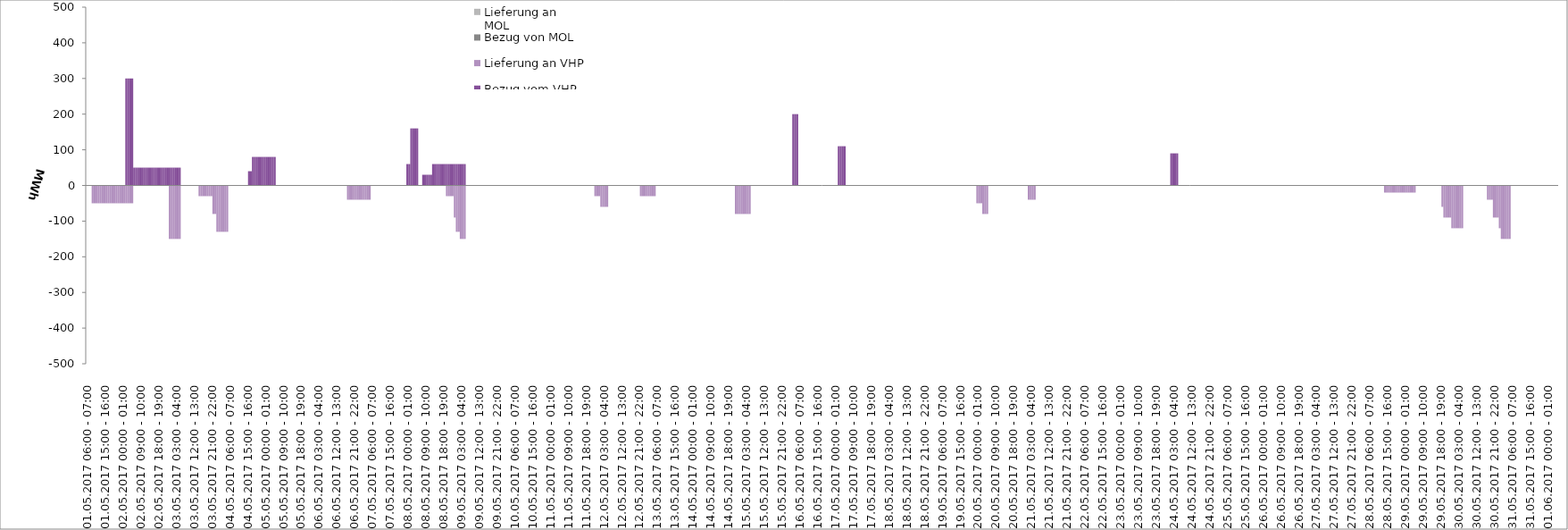
| Category | Bezug vom VHP | Lieferung an VHP | Bezug von MOL | Lieferung an MOL |
|---|---|---|---|---|
| 01.05.2017 06:00 - 07:00 | 0 | 0 | 0 | 0 |
| 01.05.2017 07:00 - 08:00 | 0 | 0 | 0 | 0 |
| 01.05.2017 08:00 - 09:00 | 0 | 0 | 0 | 0 |
| 01.05.2017 09:00 - 10:00 | 0 | -50 | 0 | 0 |
| 01.05.2017 10:00 - 11:00 | 0 | -50 | 0 | 0 |
| 01.05.2017 11:00 - 12:00 | 0 | -50 | 0 | 0 |
| 01.05.2017 12:00 - 13:00 | 0 | -50 | 0 | 0 |
| 01.05.2017 13:00 - 14:00 | 0 | -50 | 0 | 0 |
| 01.05.2017 14:00 - 15:00 | 0 | -50 | 0 | 0 |
| 01.05.2017 15:00 - 16:00 | 0 | -50 | 0 | 0 |
| 01.05.2017 16:00 - 17:00 | 0 | -50 | 0 | 0 |
| 01.05.2017 17:00 - 18:00 | 0 | -50 | 0 | 0 |
| 01.05.2017 18:00 - 19:00 | 0 | -50 | 0 | 0 |
| 01.05.2017 19:00 - 20:00 | 0 | -50 | 0 | 0 |
| 01.05.2017 20:00 - 21:00 | 0 | -50 | 0 | 0 |
| 01.05.2017 21:00 - 22:00 | 0 | -50 | 0 | 0 |
| 01.05.2017 22:00 - 23:00 | 0 | -50 | 0 | 0 |
| 01.05.2017 23:00 - 24:00 | 0 | -50 | 0 | 0 |
| 02.05.2017 00:00 - 01:00 | 0 | -50 | 0 | 0 |
| 02.05.2017 01:00 - 02:00 | 0 | -50 | 0 | 0 |
| 02.05.2017 02:00 - 03:00 | 300 | -50 | 0 | 0 |
| 02.05.2017 03:00 - 04:00 | 300 | -50 | 0 | 0 |
| 02.05.2017 04:00 - 05:00 | 300 | -50 | 0 | 0 |
| 02.05.2017 05:00 - 06:00 | 300 | -50 | 0 | 0 |
| 02.05.2017 06:00 - 07:00 | 50 | 0 | 0 | 0 |
| 02.05.2017 07:00 - 08:00 | 50 | 0 | 0 | 0 |
| 02.05.2017 08:00 - 09:00 | 50 | 0 | 0 | 0 |
| 02.05.2017 09:00 - 10:00 | 50 | 0 | 0 | 0 |
| 02.05.2017 10:00 - 11:00 | 50 | 0 | 0 | 0 |
| 02.05.2017 11:00 - 12:00 | 50 | 0 | 0 | 0 |
| 02.05.2017 12:00 - 13:00 | 50 | 0 | 0 | 0 |
| 02.05.2017 13:00 - 14:00 | 50 | 0 | 0 | 0 |
| 02.05.2017 14:00 - 15:00 | 50 | 0 | 0 | 0 |
| 02.05.2017 15:00 - 16:00 | 50 | 0 | 0 | 0 |
| 02.05.2017 16:00 - 17:00 | 50 | 0 | 0 | 0 |
| 02.05.2017 17:00 - 18:00 | 50 | 0 | 0 | 0 |
| 02.05.2017 18:00 - 19:00 | 50 | 0 | 0 | 0 |
| 02.05.2017 19:00 - 20:00 | 50 | 0 | 0 | 0 |
| 02.05.2017 20:00 - 21:00 | 50 | 0 | 0 | 0 |
| 02.05.2017 21:00 - 22:00 | 50 | 0 | 0 | 0 |
| 02.05.2017 22:00 - 23:00 | 50 | 0 | 0 | 0 |
| 02.05.2017 23:00 - 24:00 | 50 | 0 | 0 | 0 |
| 03.05.2017 00:00 - 01:00 | 50 | -150 | 0 | 0 |
| 03.05.2017 01:00 - 02:00 | 50 | -150 | 0 | 0 |
| 03.05.2017 02:00 - 03:00 | 50 | -150 | 0 | 0 |
| 03.05.2017 03:00 - 04:00 | 50 | -150 | 0 | 0 |
| 03.05.2017 04:00 - 05:00 | 50 | -150 | 0 | 0 |
| 03.05.2017 05:00 - 06:00 | 50 | -150 | 0 | 0 |
| 03.05.2017 06:00 - 07:00 | 0 | 0 | 0 | 0 |
| 03.05.2017 07:00 - 08:00 | 0 | 0 | 0 | 0 |
| 03.05.2017 08:00 - 09:00 | 0 | 0 | 0 | 0 |
| 03.05.2017 09:00 - 10:00 | 0 | 0 | 0 | 0 |
| 03.05.2017 10:00 - 11:00 | 0 | 0 | 0 | 0 |
| 03.05.2017 11:00 - 12:00 | 0 | 0 | 0 | 0 |
| 03.05.2017 12:00 - 13:00 | 0 | 0 | 0 | 0 |
| 03.05.2017 13:00 - 14:00 | 0 | 0 | 0 | 0 |
| 03.05.2017 14:00 - 15:00 | 0 | 0 | 0 | 0 |
| 03.05.2017 15:00 - 16:00 | 0 | -30 | 0 | 0 |
| 03.05.2017 16:00 - 17:00 | 0 | -30 | 0 | 0 |
| 03.05.2017 17:00 - 18:00 | 0 | -30 | 0 | 0 |
| 03.05.2017 18:00 - 19:00 | 0 | -30 | 0 | 0 |
| 03.05.2017 19:00 - 20:00 | 0 | -30 | 0 | 0 |
| 03.05.2017 20:00 - 21:00 | 0 | -30 | 0 | 0 |
| 03.05.2017 21:00 - 22:00 | 0 | -30 | 0 | 0 |
| 03.05.2017 22:00 - 23:00 | 0 | -80 | 0 | 0 |
| 03.05.2017 23:00 - 24:00 | 0 | -80 | 0 | 0 |
| 04.05.2017 00:00 - 01:00 | 0 | -130 | 0 | 0 |
| 04.05.2017 01:00 - 02:00 | 0 | -130 | 0 | 0 |
| 04.05.2017 02:00 - 03:00 | 0 | -130 | 0 | 0 |
| 04.05.2017 03:00 - 04:00 | 0 | -130 | 0 | 0 |
| 04.05.2017 04:00 - 05:00 | 0 | -130 | 0 | 0 |
| 04.05.2017 05:00 - 06:00 | 0 | -130 | 0 | 0 |
| 04.05.2017 06:00 - 07:00 | 0 | 0 | 0 | 0 |
| 04.05.2017 07:00 - 08:00 | 0 | 0 | 0 | 0 |
| 04.05.2017 08:00 - 09:00 | 0 | 0 | 0 | 0 |
| 04.05.2017 09:00 - 10:00 | 0 | 0 | 0 | 0 |
| 04.05.2017 10:00 - 11:00 | 0 | 0 | 0 | 0 |
| 04.05.2017 11:00 - 12:00 | 0 | 0 | 0 | 0 |
| 04.05.2017 12:00 - 13:00 | 0 | 0 | 0 | 0 |
| 04.05.2017 13:00 - 14:00 | 0 | 0 | 0 | 0 |
| 04.05.2017 14:00 - 15:00 | 0 | 0 | 0 | 0 |
| 04.05.2017 15:00 - 16:00 | 0 | 0 | 0 | 0 |
| 04.05.2017 16:00 - 17:00 | 40 | 0 | 0 | 0 |
| 04.05.2017 17:00 - 18:00 | 40 | 0 | 0 | 0 |
| 04.05.2017 18:00 - 19:00 | 80 | 0 | 0 | 0 |
| 04.05.2017 19:00 - 20:00 | 80 | 0 | 0 | 0 |
| 04.05.2017 20:00 - 21:00 | 80 | 0 | 0 | 0 |
| 04.05.2017 21:00 - 22:00 | 80 | 0 | 0 | 0 |
| 04.05.2017 22:00 - 23:00 | 80 | 0 | 0 | 0 |
| 04.05.2017 23:00 - 24:00 | 80 | 0 | 0 | 0 |
| 05.05.2017 00:00 - 01:00 | 80 | 0 | 0 | 0 |
| 05.05.2017 01:00 - 02:00 | 80 | 0 | 0 | 0 |
| 05.05.2017 02:00 - 03:00 | 80 | 0 | 0 | 0 |
| 05.05.2017 03:00 - 04:00 | 80 | 0 | 0 | 0 |
| 05.05.2017 04:00 - 05:00 | 80 | 0 | 0 | 0 |
| 05.05.2017 05:00 - 06:00 | 80 | 0 | 0 | 0 |
| 05.05.2017 06:00 - 07:00 | 0 | 0 | 0 | 0 |
| 05.05.2017 07:00 - 08:00 | 0 | 0 | 0 | 0 |
| 05.05.2017 08:00 - 09:00 | 0 | 0 | 0 | 0 |
| 05.05.2017 09:00 - 10:00 | 0 | 0 | 0 | 0 |
| 05.05.2017 10:00 - 11:00 | 0 | 0 | 0 | 0 |
| 05.05.2017 11:00 - 12:00 | 0 | 0 | 0 | 0 |
| 05.05.2017 12:00 - 13:00 | 0 | 0 | 0 | 0 |
| 05.05.2017 13:00 - 14:00 | 0 | 0 | 0 | 0 |
| 05.05.2017 14:00 - 15:00 | 0 | 0 | 0 | 0 |
| 05.05.2017 15:00 - 16:00 | 0 | 0 | 0 | 0 |
| 05.05.2017 16:00 - 17:00 | 0 | 0 | 0 | 0 |
| 05.05.2017 17:00 - 18:00 | 0 | 0 | 0 | 0 |
| 05.05.2017 18:00 - 19:00 | 0 | 0 | 0 | 0 |
| 05.05.2017 19:00 - 20:00 | 0 | 0 | 0 | 0 |
| 05.05.2017 20:00 - 21:00 | 0 | 0 | 0 | 0 |
| 05.05.2017 21:00 - 22:00 | 0 | 0 | 0 | 0 |
| 05.05.2017 22:00 - 23:00 | 0 | 0 | 0 | 0 |
| 05.05.2017 23:00 - 24:00 | 0 | 0 | 0 | 0 |
| 06.05.2017 00:00 - 01:00 | 0 | 0 | 0 | 0 |
| 06.05.2017 01:00 - 02:00 | 0 | 0 | 0 | 0 |
| 06.05.2017 02:00 - 03:00 | 0 | 0 | 0 | 0 |
| 06.05.2017 03:00 - 04:00 | 0 | 0 | 0 | 0 |
| 06.05.2017 04:00 - 05:00 | 0 | 0 | 0 | 0 |
| 06.05.2017 05:00 - 06:00 | 0 | 0 | 0 | 0 |
| 06.05.2017 06:00 - 07:00 | 0 | 0 | 0 | 0 |
| 06.05.2017 07:00 - 08:00 | 0 | 0 | 0 | 0 |
| 06.05.2017 08:00 - 09:00 | 0 | 0 | 0 | 0 |
| 06.05.2017 09:00 - 10:00 | 0 | 0 | 0 | 0 |
| 06.05.2017 10:00 - 11:00 | 0 | 0 | 0 | 0 |
| 06.05.2017 11:00 - 12:00 | 0 | 0 | 0 | 0 |
| 06.05.2017 12:00 - 13:00 | 0 | 0 | 0 | 0 |
| 06.05.2017 13:00 - 14:00 | 0 | 0 | 0 | 0 |
| 06.05.2017 14:00 - 15:00 | 0 | 0 | 0 | 0 |
| 06.05.2017 15:00 - 16:00 | 0 | 0 | 0 | 0 |
| 06.05.2017 16:00 - 17:00 | 0 | 0 | 0 | 0 |
| 06.05.2017 17:00 - 18:00 | 0 | 0 | 0 | 0 |
| 06.05.2017 18:00 - 19:00 | 0 | -40 | 0 | 0 |
| 06.05.2017 19:00 - 20:00 | 0 | -40 | 0 | 0 |
| 06.05.2017 20:00 - 21:00 | 0 | -40 | 0 | 0 |
| 06.05.2017 21:00 - 22:00 | 0 | -40 | 0 | 0 |
| 06.05.2017 22:00 - 23:00 | 0 | -40 | 0 | 0 |
| 06.05.2017 23:00 - 24:00 | 0 | -40 | 0 | 0 |
| 07.05.2017 00:00 - 01:00 | 0 | -40 | 0 | 0 |
| 07.05.2017 01:00 - 02:00 | 0 | -40 | 0 | 0 |
| 07.05.2017 02:00 - 03:00 | 0 | -40 | 0 | 0 |
| 07.05.2017 03:00 - 04:00 | 0 | -40 | 0 | 0 |
| 07.05.2017 04:00 - 05:00 | 0 | -40 | 0 | 0 |
| 07.05.2017 05:00 - 06:00 | 0 | -40 | 0 | 0 |
| 07.05.2017 06:00 - 07:00 | 0 | 0 | 0 | 0 |
| 07.05.2017 07:00 - 08:00 | 0 | 0 | 0 | 0 |
| 07.05.2017 08:00 - 09:00 | 0 | 0 | 0 | 0 |
| 07.05.2017 09:00 - 10:00 | 0 | 0 | 0 | 0 |
| 07.05.2017 10:00 - 11:00 | 0 | 0 | 0 | 0 |
| 07.05.2017 11:00 - 12:00 | 0 | 0 | 0 | 0 |
| 07.05.2017 12:00 - 13:00 | 0 | 0 | 0 | 0 |
| 07.05.2017 13:00 - 14:00 | 0 | 0 | 0 | 0 |
| 07.05.2017 14:00 - 15:00 | 0 | 0 | 0 | 0 |
| 07.05.2017 15:00 - 16:00 | 0 | 0 | 0 | 0 |
| 07.05.2017 16:00 - 17:00 | 0 | 0 | 0 | 0 |
| 07.05.2017 17:00 - 18:00 | 0 | 0 | 0 | 0 |
| 07.05.2017 18:00 - 19:00 | 0 | 0 | 0 | 0 |
| 07.05.2017 19:00 - 20:00 | 0 | 0 | 0 | 0 |
| 07.05.2017 20:00 - 21:00 | 0 | 0 | 0 | 0 |
| 07.05.2017 21:00 - 22:00 | 0 | 0 | 0 | 0 |
| 07.05.2017 22:00 - 23:00 | 0 | 0 | 0 | 0 |
| 07.05.2017 23:00 - 24:00 | 0 | 0 | 0 | 0 |
| 08.05.2017 00:00 - 01:00 | 60 | 0 | 0 | 0 |
| 08.05.2017 01:00 - 02:00 | 60 | 0 | 0 | 0 |
| 08.05.2017 02:00 - 03:00 | 160 | 0 | 0 | 0 |
| 08.05.2017 03:00 - 04:00 | 160 | 0 | 0 | 0 |
| 08.05.2017 04:00 - 05:00 | 160 | 0 | 0 | 0 |
| 08.05.2017 05:00 - 06:00 | 160 | 0 | 0 | 0 |
| 08.05.2017 06:00 - 07:00 | 0 | 0 | 0 | 0 |
| 08.05.2017 07:00 - 08:00 | 0 | 0 | 0 | 0 |
| 08.05.2017 08:00 - 09:00 | 30 | 0 | 0 | 0 |
| 08.05.2017 09:00 - 10:00 | 30 | 0 | 0 | 0 |
| 08.05.2017 10:00 - 11:00 | 30 | 0 | 0 | 0 |
| 08.05.2017 11:00 - 12:00 | 30 | 0 | 0 | 0 |
| 08.05.2017 12:00 - 13:00 | 30 | 0 | 0 | 0 |
| 08.05.2017 13:00 - 14:00 | 60 | 0 | 0 | 0 |
| 08.05.2017 14:00 - 15:00 | 60 | 0 | 0 | 0 |
| 08.05.2017 15:00 - 16:00 | 60 | 0 | 0 | 0 |
| 08.05.2017 16:00 - 17:00 | 60 | 0 | 0 | 0 |
| 08.05.2017 17:00 - 18:00 | 60 | 0 | 0 | 0 |
| 08.05.2017 18:00 - 19:00 | 60 | 0 | 0 | 0 |
| 08.05.2017 19:00 - 20:00 | 60 | 0 | 0 | 0 |
| 08.05.2017 20:00 - 21:00 | 60 | -30 | 0 | 0 |
| 08.05.2017 21:00 - 22:00 | 60 | -30 | 0 | 0 |
| 08.05.2017 22:00 - 23:00 | 60 | -30 | 0 | 0 |
| 08.05.2017 23:00 - 24:00 | 60 | -30 | 0 | 0 |
| 09.05.2017 00:00 - 01:00 | 60 | -90 | 0 | 0 |
| 09.05.2017 01:00 - 02:00 | 60 | -130 | 0 | 0 |
| 09.05.2017 02:00 - 03:00 | 60 | -130 | 0 | 0 |
| 09.05.2017 03:00 - 04:00 | 60 | -150 | 0 | 0 |
| 09.05.2017 04:00 - 05:00 | 60 | -150 | 0 | 0 |
| 09.05.2017 05:00 - 06:00 | 60 | -150 | 0 | 0 |
| 09.05.2017 06:00 - 07:00 | 0 | 0 | 0 | 0 |
| 09.05.2017 07:00 - 08:00 | 0 | 0 | 0 | 0 |
| 09.05.2017 08:00 - 09:00 | 0 | 0 | 0 | 0 |
| 09.05.2017 09:00 - 10:00 | 0 | 0 | 0 | 0 |
| 09.05.2017 10:00 - 11:00 | 0 | 0 | 0 | 0 |
| 09.05.2017 11:00 - 12:00 | 0 | 0 | 0 | 0 |
| 09.05.2017 12:00 - 13:00 | 0 | 0 | 0 | 0 |
| 09.05.2017 13:00 - 14:00 | 0 | 0 | 0 | 0 |
| 09.05.2017 14:00 - 15:00 | 0 | 0 | 0 | 0 |
| 09.05.2017 15:00 - 16:00 | 0 | 0 | 0 | 0 |
| 09.05.2017 16:00 - 17:00 | 0 | 0 | 0 | 0 |
| 09.05.2017 17:00 - 18:00 | 0 | 0 | 0 | 0 |
| 09.05.2017 18:00 - 19:00 | 0 | 0 | 0 | 0 |
| 09.05.2017 19:00 - 20:00 | 0 | 0 | 0 | 0 |
| 09.05.2017 20:00 - 21:00 | 0 | 0 | 0 | 0 |
| 09.05.2017 21:00 - 22:00 | 0 | 0 | 0 | 0 |
| 09.05.2017 22:00 - 23:00 | 0 | 0 | 0 | 0 |
| 09.05.2017 23:00 - 24:00 | 0 | 0 | 0 | 0 |
| 10.05.2017 00:00 - 01:00 | 0 | 0 | 0 | 0 |
| 10.05.2017 01:00 - 02:00 | 0 | 0 | 0 | 0 |
| 10.05.2017 02:00 - 03:00 | 0 | 0 | 0 | 0 |
| 10.05.2017 03:00 - 04:00 | 0 | 0 | 0 | 0 |
| 10.05.2017 04:00 - 05:00 | 0 | 0 | 0 | 0 |
| 10.05.2017 05:00 - 06:00 | 0 | 0 | 0 | 0 |
| 10.05.2017 06:00 - 07:00 | 0 | 0 | 0 | 0 |
| 10.05.2017 07:00 - 08:00 | 0 | 0 | 0 | 0 |
| 10.05.2017 08:00 - 09:00 | 0 | 0 | 0 | 0 |
| 10.05.2017 09:00 - 10:00 | 0 | 0 | 0 | 0 |
| 10.05.2017 10:00 - 11:00 | 0 | 0 | 0 | 0 |
| 10.05.2017 11:00 - 12:00 | 0 | 0 | 0 | 0 |
| 10.05.2017 12:00 - 13:00 | 0 | 0 | 0 | 0 |
| 10.05.2017 13:00 - 14:00 | 0 | 0 | 0 | 0 |
| 10.05.2017 14:00 - 15:00 | 0 | 0 | 0 | 0 |
| 10.05.2017 15:00 - 16:00 | 0 | 0 | 0 | 0 |
| 10.05.2017 16:00 - 17:00 | 0 | 0 | 0 | 0 |
| 10.05.2017 17:00 - 18:00 | 0 | 0 | 0 | 0 |
| 10.05.2017 18:00 - 19:00 | 0 | 0 | 0 | 0 |
| 10.05.2017 19:00 - 20:00 | 0 | 0 | 0 | 0 |
| 10.05.2017 20:00 - 21:00 | 0 | 0 | 0 | 0 |
| 10.05.2017 21:00 - 22:00 | 0 | 0 | 0 | 0 |
| 10.05.2017 22:00 - 23:00 | 0 | 0 | 0 | 0 |
| 10.05.2017 23:00 - 24:00 | 0 | 0 | 0 | 0 |
| 11.05.2017 00:00 - 01:00 | 0 | 0 | 0 | 0 |
| 11.05.2017 01:00 - 02:00 | 0 | 0 | 0 | 0 |
| 11.05.2017 02:00 - 03:00 | 0 | 0 | 0 | 0 |
| 11.05.2017 03:00 - 04:00 | 0 | 0 | 0 | 0 |
| 11.05.2017 04:00 - 05:00 | 0 | 0 | 0 | 0 |
| 11.05.2017 05:00 - 06:00 | 0 | 0 | 0 | 0 |
| 11.05.2017 06:00 - 07:00 | 0 | 0 | 0 | 0 |
| 11.05.2017 07:00 - 08:00 | 0 | 0 | 0 | 0 |
| 11.05.2017 08:00 - 09:00 | 0 | 0 | 0 | 0 |
| 11.05.2017 09:00 - 10:00 | 0 | 0 | 0 | 0 |
| 11.05.2017 10:00 - 11:00 | 0 | 0 | 0 | 0 |
| 11.05.2017 11:00 - 12:00 | 0 | 0 | 0 | 0 |
| 11.05.2017 12:00 - 13:00 | 0 | 0 | 0 | 0 |
| 11.05.2017 13:00 - 14:00 | 0 | 0 | 0 | 0 |
| 11.05.2017 14:00 - 15:00 | 0 | 0 | 0 | 0 |
| 11.05.2017 15:00 - 16:00 | 0 | 0 | 0 | 0 |
| 11.05.2017 16:00 - 17:00 | 0 | 0 | 0 | 0 |
| 11.05.2017 17:00 - 18:00 | 0 | 0 | 0 | 0 |
| 11.05.2017 18:00 - 19:00 | 0 | 0 | 0 | 0 |
| 11.05.2017 19:00 - 20:00 | 0 | 0 | 0 | 0 |
| 11.05.2017 20:00 - 21:00 | 0 | 0 | 0 | 0 |
| 11.05.2017 21:00 - 22:00 | 0 | 0 | 0 | 0 |
| 11.05.2017 22:00 - 23:00 | 0 | 0 | 0 | 0 |
| 11.05.2017 23:00 - 24:00 | 0 | -30 | 0 | 0 |
| 12.05.2017 00:00 - 01:00 | 0 | -30 | 0 | 0 |
| 12.05.2017 01:00 - 02:00 | 0 | -30 | 0 | 0 |
| 12.05.2017 02:00 - 03:00 | 0 | -60 | 0 | 0 |
| 12.05.2017 03:00 - 04:00 | 0 | -60 | 0 | 0 |
| 12.05.2017 04:00 - 05:00 | 0 | -60 | 0 | 0 |
| 12.05.2017 05:00 - 06:00 | 0 | -60 | 0 | 0 |
| 12.05.2017 06:00 - 07:00 | 0 | 0 | 0 | 0 |
| 12.05.2017 07:00 - 08:00 | 0 | 0 | 0 | 0 |
| 12.05.2017 08:00 - 09:00 | 0 | 0 | 0 | 0 |
| 12.05.2017 09:00 - 10:00 | 0 | 0 | 0 | 0 |
| 12.05.2017 10:00 - 11:00 | 0 | 0 | 0 | 0 |
| 12.05.2017 11:00 - 12:00 | 0 | 0 | 0 | 0 |
| 12.05.2017 12:00 - 13:00 | 0 | 0 | 0 | 0 |
| 12.05.2017 13:00 - 14:00 | 0 | 0 | 0 | 0 |
| 12.05.2017 14:00 - 15:00 | 0 | 0 | 0 | 0 |
| 12.05.2017 15:00 - 16:00 | 0 | 0 | 0 | 0 |
| 12.05.2017 16:00 - 17:00 | 0 | 0 | 0 | 0 |
| 12.05.2017 17:00 - 18:00 | 0 | 0 | 0 | 0 |
| 12.05.2017 18:00 - 19:00 | 0 | 0 | 0 | 0 |
| 12.05.2017 19:00 - 20:00 | 0 | 0 | 0 | 0 |
| 12.05.2017 20:00 - 21:00 | 0 | 0 | 0 | 0 |
| 12.05.2017 21:00 - 22:00 | 0 | 0 | 0 | 0 |
| 12.05.2017 22:00 - 23:00 | 0 | -30 | 0 | 0 |
| 12.05.2017 23:00 - 24:00 | 0 | -30 | 0 | 0 |
| 13.05.2017 00:00 - 01:00 | 0 | -30 | 0 | 0 |
| 13.05.2017 01:00 - 02:00 | 0 | -30 | 0 | 0 |
| 13.05.2017 02:00 - 03:00 | 0 | -30 | 0 | 0 |
| 13.05.2017 03:00 - 04:00 | 0 | -30 | 0 | 0 |
| 13.05.2017 04:00 - 05:00 | 0 | -30 | 0 | 0 |
| 13.05.2017 05:00 - 06:00 | 0 | -30 | 0 | 0 |
| 13.05.2017 06:00 - 07:00 | 0 | 0 | 0 | 0 |
| 13.05.2017 07:00 - 08:00 | 0 | 0 | 0 | 0 |
| 13.05.2017 08:00 - 09:00 | 0 | 0 | 0 | 0 |
| 13.05.2017 09:00 - 10:00 | 0 | 0 | 0 | 0 |
| 13.05.2017 10:00 - 11:00 | 0 | 0 | 0 | 0 |
| 13.05.2017 11:00 - 12:00 | 0 | 0 | 0 | 0 |
| 13.05.2017 12:00 - 13:00 | 0 | 0 | 0 | 0 |
| 13.05.2017 13:00 - 14:00 | 0 | 0 | 0 | 0 |
| 13.05.2017 14:00 - 15:00 | 0 | 0 | 0 | 0 |
| 13.05.2017 15:00 - 16:00 | 0 | 0 | 0 | 0 |
| 13.05.2017 16:00 - 17:00 | 0 | 0 | 0 | 0 |
| 13.05.2017 17:00 - 18:00 | 0 | 0 | 0 | 0 |
| 13.05.2017 18:00 - 19:00 | 0 | 0 | 0 | 0 |
| 13.05.2017 19:00 - 20:00 | 0 | 0 | 0 | 0 |
| 13.05.2017 20:00 - 21:00 | 0 | 0 | 0 | 0 |
| 13.05.2017 21:00 - 22:00 | 0 | 0 | 0 | 0 |
| 13.05.2017 22:00 - 23:00 | 0 | 0 | 0 | 0 |
| 13.05.2017 23:00 - 24:00 | 0 | 0 | 0 | 0 |
| 14.05.2017 00:00 - 01:00 | 0 | 0 | 0 | 0 |
| 14.05.2017 01:00 - 02:00 | 0 | 0 | 0 | 0 |
| 14.05.2017 02:00 - 03:00 | 0 | 0 | 0 | 0 |
| 14.05.2017 03:00 - 04:00 | 0 | 0 | 0 | 0 |
| 14.05.2017 04:00 - 05:00 | 0 | 0 | 0 | 0 |
| 14.05.2017 05:00 - 06:00 | 0 | 0 | 0 | 0 |
| 14.05.2017 06:00 - 07:00 | 0 | 0 | 0 | 0 |
| 14.05.2017 07:00 - 08:00 | 0 | 0 | 0 | 0 |
| 14.05.2017 08:00 - 09:00 | 0 | 0 | 0 | 0 |
| 14.05.2017 09:00 - 10:00 | 0 | 0 | 0 | 0 |
| 14.05.2017 10:00 - 11:00 | 0 | 0 | 0 | 0 |
| 14.05.2017 11:00 - 12:00 | 0 | 0 | 0 | 0 |
| 14.05.2017 12:00 - 13:00 | 0 | 0 | 0 | 0 |
| 14.05.2017 13:00 - 14:00 | 0 | 0 | 0 | 0 |
| 14.05.2017 14:00 - 15:00 | 0 | 0 | 0 | 0 |
| 14.05.2017 15:00 - 16:00 | 0 | 0 | 0 | 0 |
| 14.05.2017 16:00 - 17:00 | 0 | 0 | 0 | 0 |
| 14.05.2017 17:00 - 18:00 | 0 | 0 | 0 | 0 |
| 14.05.2017 18:00 - 19:00 | 0 | 0 | 0 | 0 |
| 14.05.2017 19:00 - 20:00 | 0 | 0 | 0 | 0 |
| 14.05.2017 20:00 - 21:00 | 0 | 0 | 0 | 0 |
| 14.05.2017 21:00 - 22:00 | 0 | 0 | 0 | 0 |
| 14.05.2017 22:00 - 23:00 | 0 | -80 | 0 | 0 |
| 14.05.2017 23:00 - 24:00 | 0 | -80 | 0 | 0 |
| 15.05.2017 00:00 - 01:00 | 0 | -80 | 0 | 0 |
| 15.05.2017 01:00 - 02:00 | 0 | -80 | 0 | 0 |
| 15.05.2017 02:00 - 03:00 | 0 | -80 | 0 | 0 |
| 15.05.2017 03:00 - 04:00 | 0 | -80 | 0 | 0 |
| 15.05.2017 04:00 - 05:00 | 0 | -80 | 0 | 0 |
| 15.05.2017 05:00 - 06:00 | 0 | -80 | 0 | 0 |
| 15.05.2017 06:00 - 07:00 | 0 | 0 | 0 | 0 |
| 15.05.2017 07:00 - 08:00 | 0 | 0 | 0 | 0 |
| 15.05.2017 08:00 - 09:00 | 0 | 0 | 0 | 0 |
| 15.05.2017 09:00 - 10:00 | 0 | 0 | 0 | 0 |
| 15.05.2017 10:00 - 11:00 | 0 | 0 | 0 | 0 |
| 15.05.2017 11:00 - 12:00 | 0 | 0 | 0 | 0 |
| 15.05.2017 12:00 - 13:00 | 0 | 0 | 0 | 0 |
| 15.05.2017 13:00 - 14:00 | 0 | 0 | 0 | 0 |
| 15.05.2017 14:00 - 15:00 | 0 | 0 | 0 | 0 |
| 15.05.2017 15:00 - 16:00 | 0 | 0 | 0 | 0 |
| 15.05.2017 16:00 - 17:00 | 0 | 0 | 0 | 0 |
| 15.05.2017 17:00 - 18:00 | 0 | 0 | 0 | 0 |
| 15.05.2017 18:00 - 19:00 | 0 | 0 | 0 | 0 |
| 15.05.2017 19:00 - 20:00 | 0 | 0 | 0 | 0 |
| 15.05.2017 20:00 - 21:00 | 0 | 0 | 0 | 0 |
| 15.05.2017 21:00 - 22:00 | 0 | 0 | 0 | 0 |
| 15.05.2017 22:00 - 23:00 | 0 | 0 | 0 | 0 |
| 15.05.2017 23:00 - 24:00 | 0 | 0 | 0 | 0 |
| 16.05.2017 00:00 - 01:00 | 0 | 0 | 0 | 0 |
| 16.05.2017 01:00 - 02:00 | 0 | 0 | 0 | 0 |
| 16.05.2017 02:00 - 03:00 | 0 | 0 | 0 | 0 |
| 16.05.2017 03:00 - 04:00 | 200 | 0 | 0 | 0 |
| 16.05.2017 04:00 - 05:00 | 200 | 0 | 0 | 0 |
| 16.05.2017 05:00 - 06:00 | 200 | 0 | 0 | 0 |
| 16.05.2017 06:00 - 07:00 | 0 | 0 | 0 | 0 |
| 16.05.2017 07:00 - 08:00 | 0 | 0 | 0 | 0 |
| 16.05.2017 08:00 - 09:00 | 0 | 0 | 0 | 0 |
| 16.05.2017 09:00 - 10:00 | 0 | 0 | 0 | 0 |
| 16.05.2017 10:00 - 11:00 | 0 | 0 | 0 | 0 |
| 16.05.2017 11:00 - 12:00 | 0 | 0 | 0 | 0 |
| 16.05.2017 12:00 - 13:00 | 0 | 0 | 0 | 0 |
| 16.05.2017 13:00 - 14:00 | 0 | 0 | 0 | 0 |
| 16.05.2017 14:00 - 15:00 | 0 | 0 | 0 | 0 |
| 16.05.2017 15:00 - 16:00 | 0 | 0 | 0 | 0 |
| 16.05.2017 16:00 - 17:00 | 0 | 0 | 0 | 0 |
| 16.05.2017 17:00 - 18:00 | 0 | 0 | 0 | 0 |
| 16.05.2017 18:00 - 19:00 | 0 | 0 | 0 | 0 |
| 16.05.2017 19:00 - 20:00 | 0 | 0 | 0 | 0 |
| 16.05.2017 20:00 - 21:00 | 0 | 0 | 0 | 0 |
| 16.05.2017 21:00 - 22:00 | 0 | 0 | 0 | 0 |
| 16.05.2017 22:00 - 23:00 | 0 | 0 | 0 | 0 |
| 16.05.2017 23:00 - 24:00 | 0 | 0 | 0 | 0 |
| 17.05.2017 00:00 - 01:00 | 0 | 0 | 0 | 0 |
| 17.05.2017 01:00 - 02:00 | 0 | 0 | 0 | 0 |
| 17.05.2017 02:00 - 03:00 | 110 | 0 | 0 | 0 |
| 17.05.2017 03:00 - 04:00 | 110 | 0 | 0 | 0 |
| 17.05.2017 04:00 - 05:00 | 110 | 0 | 0 | 0 |
| 17.05.2017 05:00 - 06:00 | 110 | 0 | 0 | 0 |
| 17.05.2017 06:00 - 07:00 | 0 | 0 | 0 | 0 |
| 17.05.2017 07:00 - 08:00 | 0 | 0 | 0 | 0 |
| 17.05.2017 08:00 - 09:00 | 0 | 0 | 0 | 0 |
| 17.05.2017 09:00 - 10:00 | 0 | 0 | 0 | 0 |
| 17.05.2017 10:00 - 11:00 | 0 | 0 | 0 | 0 |
| 17.05.2017 11:00 - 12:00 | 0 | 0 | 0 | 0 |
| 17.05.2017 12:00 - 13:00 | 0 | 0 | 0 | 0 |
| 17.05.2017 13:00 - 14:00 | 0 | 0 | 0 | 0 |
| 17.05.2017 14:00 - 15:00 | 0 | 0 | 0 | 0 |
| 17.05.2017 15:00 - 16:00 | 0 | 0 | 0 | 0 |
| 17.05.2017 16:00 - 17:00 | 0 | 0 | 0 | 0 |
| 17.05.2017 17:00 - 18:00 | 0 | 0 | 0 | 0 |
| 17.05.2017 18:00 - 19:00 | 0 | 0 | 0 | 0 |
| 17.05.2017 19:00 - 20:00 | 0 | 0 | 0 | 0 |
| 17.05.2017 20:00 - 21:00 | 0 | 0 | 0 | 0 |
| 17.05.2017 21:00 - 22:00 | 0 | 0 | 0 | 0 |
| 17.05.2017 22:00 - 23:00 | 0 | 0 | 0 | 0 |
| 17.05.2017 23:00 - 24:00 | 0 | 0 | 0 | 0 |
| 18.05.2017 00:00 - 01:00 | 0 | 0 | 0 | 0 |
| 18.05.2017 01:00 - 02:00 | 0 | 0 | 0 | 0 |
| 18.05.2017 02:00 - 03:00 | 0 | 0 | 0 | 0 |
| 18.05.2017 03:00 - 04:00 | 0 | 0 | 0 | 0 |
| 18.05.2017 04:00 - 05:00 | 0 | 0 | 0 | 0 |
| 18.05.2017 05:00 - 06:00 | 0 | 0 | 0 | 0 |
| 18.05.2017 06:00 - 07:00 | 0 | 0 | 0 | 0 |
| 18.05.2017 07:00 - 08:00 | 0 | 0 | 0 | 0 |
| 18.05.2017 08:00 - 09:00 | 0 | 0 | 0 | 0 |
| 18.05.2017 09:00 - 10:00 | 0 | 0 | 0 | 0 |
| 18.05.2017 10:00 - 11:00 | 0 | 0 | 0 | 0 |
| 18.05.2017 11:00 - 12:00 | 0 | 0 | 0 | 0 |
| 18.05.2017 12:00 - 13:00 | 0 | 0 | 0 | 0 |
| 18.05.2017 13:00 - 14:00 | 0 | 0 | 0 | 0 |
| 18.05.2017 14:00 - 15:00 | 0 | 0 | 0 | 0 |
| 18.05.2017 15:00 - 16:00 | 0 | 0 | 0 | 0 |
| 18.05.2017 16:00 - 17:00 | 0 | 0 | 0 | 0 |
| 18.05.2017 17:00 - 18:00 | 0 | 0 | 0 | 0 |
| 18.05.2017 18:00 - 19:00 | 0 | 0 | 0 | 0 |
| 18.05.2017 19:00 - 20:00 | 0 | 0 | 0 | 0 |
| 18.05.2017 20:00 - 21:00 | 0 | 0 | 0 | 0 |
| 18.05.2017 21:00 - 22:00 | 0 | 0 | 0 | 0 |
| 18.05.2017 22:00 - 23:00 | 0 | 0 | 0 | 0 |
| 18.05.2017 23:00 - 24:00 | 0 | 0 | 0 | 0 |
| 19.05.2017 00:00 - 01:00 | 0 | 0 | 0 | 0 |
| 19.05.2017 01:00 - 02:00 | 0 | 0 | 0 | 0 |
| 19.05.2017 02:00 - 03:00 | 0 | 0 | 0 | 0 |
| 19.05.2017 03:00 - 04:00 | 0 | 0 | 0 | 0 |
| 19.05.2017 04:00 - 05:00 | 0 | 0 | 0 | 0 |
| 19.05.2017 05:00 - 06:00 | 0 | 0 | 0 | 0 |
| 19.05.2017 06:00 - 07:00 | 0 | 0 | 0 | 0 |
| 19.05.2017 07:00 - 08:00 | 0 | 0 | 0 | 0 |
| 19.05.2017 08:00 - 09:00 | 0 | 0 | 0 | 0 |
| 19.05.2017 09:00 - 10:00 | 0 | 0 | 0 | 0 |
| 19.05.2017 10:00 - 11:00 | 0 | 0 | 0 | 0 |
| 19.05.2017 11:00 - 12:00 | 0 | 0 | 0 | 0 |
| 19.05.2017 12:00 - 13:00 | 0 | 0 | 0 | 0 |
| 19.05.2017 13:00 - 14:00 | 0 | 0 | 0 | 0 |
| 19.05.2017 14:00 - 15:00 | 0 | 0 | 0 | 0 |
| 19.05.2017 15:00 - 16:00 | 0 | 0 | 0 | 0 |
| 19.05.2017 16:00 - 17:00 | 0 | 0 | 0 | 0 |
| 19.05.2017 17:00 - 18:00 | 0 | 0 | 0 | 0 |
| 19.05.2017 18:00 - 19:00 | 0 | 0 | 0 | 0 |
| 19.05.2017 19:00 - 20:00 | 0 | 0 | 0 | 0 |
| 19.05.2017 20:00 - 21:00 | 0 | 0 | 0 | 0 |
| 19.05.2017 21:00 - 22:00 | 0 | 0 | 0 | 0 |
| 19.05.2017 22:00 - 23:00 | 0 | 0 | 0 | 0 |
| 19.05.2017 23:00 - 24:00 | 0 | 0 | 0 | 0 |
| 20.05.2017 00:00 - 01:00 | 0 | -50 | 0 | 0 |
| 20.05.2017 01:00 - 02:00 | 0 | -50 | 0 | 0 |
| 20.05.2017 02:00 - 03:00 | 0 | -50 | 0 | 0 |
| 20.05.2017 03:00 - 04:00 | 0 | -80 | 0 | 0 |
| 20.05.2017 04:00 - 05:00 | 0 | -80 | 0 | 0 |
| 20.05.2017 05:00 - 06:00 | 0 | -80 | 0 | 0 |
| 20.05.2017 06:00 - 07:00 | 0 | 0 | 0 | 0 |
| 20.05.2017 07:00 - 08:00 | 0 | 0 | 0 | 0 |
| 20.05.2017 08:00 - 09:00 | 0 | 0 | 0 | 0 |
| 20.05.2017 09:00 - 10:00 | 0 | 0 | 0 | 0 |
| 20.05.2017 10:00 - 11:00 | 0 | 0 | 0 | 0 |
| 20.05.2017 11:00 - 12:00 | 0 | 0 | 0 | 0 |
| 20.05.2017 12:00 - 13:00 | 0 | 0 | 0 | 0 |
| 20.05.2017 13:00 - 14:00 | 0 | 0 | 0 | 0 |
| 20.05.2017 14:00 - 15:00 | 0 | 0 | 0 | 0 |
| 20.05.2017 15:00 - 16:00 | 0 | 0 | 0 | 0 |
| 20.05.2017 16:00 - 17:00 | 0 | 0 | 0 | 0 |
| 20.05.2017 17:00 - 18:00 | 0 | 0 | 0 | 0 |
| 20.05.2017 18:00 - 19:00 | 0 | 0 | 0 | 0 |
| 20.05.2017 19:00 - 20:00 | 0 | 0 | 0 | 0 |
| 20.05.2017 20:00 - 21:00 | 0 | 0 | 0 | 0 |
| 20.05.2017 21:00 - 22:00 | 0 | 0 | 0 | 0 |
| 20.05.2017 22:00 - 23:00 | 0 | 0 | 0 | 0 |
| 20.05.2017 23:00 - 24:00 | 0 | 0 | 0 | 0 |
| 21.05.2017 00:00 - 01:00 | 0 | 0 | 0 | 0 |
| 21.05.2017 01:00 - 02:00 | 0 | 0 | 0 | 0 |
| 21.05.2017 02:00 - 03:00 | 0 | -40 | 0 | 0 |
| 21.05.2017 03:00 - 04:00 | 0 | -40 | 0 | 0 |
| 21.05.2017 04:00 - 05:00 | 0 | -40 | 0 | 0 |
| 21.05.2017 05:00 - 06:00 | 0 | -40 | 0 | 0 |
| 21.05.2017 06:00 - 07:00 | 0 | 0 | 0 | 0 |
| 21.05.2017 07:00 - 08:00 | 0 | 0 | 0 | 0 |
| 21.05.2017 08:00 - 09:00 | 0 | 0 | 0 | 0 |
| 21.05.2017 09:00 - 10:00 | 0 | 0 | 0 | 0 |
| 21.05.2017 10:00 - 11:00 | 0 | 0 | 0 | 0 |
| 21.05.2017 11:00 - 12:00 | 0 | 0 | 0 | 0 |
| 21.05.2017 12:00 - 13:00 | 0 | 0 | 0 | 0 |
| 21.05.2017 13:00 - 14:00 | 0 | 0 | 0 | 0 |
| 21.05.2017 14:00 - 15:00 | 0 | 0 | 0 | 0 |
| 21.05.2017 15:00 - 16:00 | 0 | 0 | 0 | 0 |
| 21.05.2017 16:00 - 17:00 | 0 | 0 | 0 | 0 |
| 21.05.2017 17:00 - 18:00 | 0 | 0 | 0 | 0 |
| 21.05.2017 18:00 - 19:00 | 0 | 0 | 0 | 0 |
| 21.05.2017 19:00 - 20:00 | 0 | 0 | 0 | 0 |
| 21.05.2017 20:00 - 21:00 | 0 | 0 | 0 | 0 |
| 21.05.2017 21:00 - 22:00 | 0 | 0 | 0 | 0 |
| 21.05.2017 22:00 - 23:00 | 0 | 0 | 0 | 0 |
| 21.05.2017 23:00 - 24:00 | 0 | 0 | 0 | 0 |
| 22.05.2017 00:00 - 01:00 | 0 | 0 | 0 | 0 |
| 22.05.2017 01:00 - 02:00 | 0 | 0 | 0 | 0 |
| 22.05.2017 02:00 - 03:00 | 0 | 0 | 0 | 0 |
| 22.05.2017 03:00 - 04:00 | 0 | 0 | 0 | 0 |
| 22.05.2017 04:00 - 05:00 | 0 | 0 | 0 | 0 |
| 22.05.2017 05:00 - 06:00 | 0 | 0 | 0 | 0 |
| 22.05.2017 06:00 - 07:00 | 0 | 0 | 0 | 0 |
| 22.05.2017 07:00 - 08:00 | 0 | 0 | 0 | 0 |
| 22.05.2017 08:00 - 09:00 | 0 | 0 | 0 | 0 |
| 22.05.2017 09:00 - 10:00 | 0 | 0 | 0 | 0 |
| 22.05.2017 10:00 - 11:00 | 0 | 0 | 0 | 0 |
| 22.05.2017 11:00 - 12:00 | 0 | 0 | 0 | 0 |
| 22.05.2017 12:00 - 13:00 | 0 | 0 | 0 | 0 |
| 22.05.2017 13:00 - 14:00 | 0 | 0 | 0 | 0 |
| 22.05.2017 14:00 - 15:00 | 0 | 0 | 0 | 0 |
| 22.05.2017 15:00 - 16:00 | 0 | 0 | 0 | 0 |
| 22.05.2017 16:00 - 17:00 | 0 | 0 | 0 | 0 |
| 22.05.2017 17:00 - 18:00 | 0 | 0 | 0 | 0 |
| 22.05.2017 18:00 - 19:00 | 0 | 0 | 0 | 0 |
| 22.05.2017 19:00 - 20:00 | 0 | 0 | 0 | 0 |
| 22.05.2017 20:00 - 21:00 | 0 | 0 | 0 | 0 |
| 22.05.2017 21:00 - 22:00 | 0 | 0 | 0 | 0 |
| 22.05.2017 22:00 - 23:00 | 0 | 0 | 0 | 0 |
| 22.05.2017 23:00 - 24:00 | 0 | 0 | 0 | 0 |
| 23.05.2017 00:00 - 01:00 | 0 | 0 | 0 | 0 |
| 23.05.2017 01:00 - 02:00 | 0 | 0 | 0 | 0 |
| 23.05.2017 02:00 - 03:00 | 0 | 0 | 0 | 0 |
| 23.05.2017 03:00 - 04:00 | 0 | 0 | 0 | 0 |
| 23.05.2017 04:00 - 05:00 | 0 | 0 | 0 | 0 |
| 23.05.2017 05:00 - 06:00 | 0 | 0 | 0 | 0 |
| 23.05.2017 06:00 - 07:00 | 0 | 0 | 0 | 0 |
| 23.05.2017 07:00 - 08:00 | 0 | 0 | 0 | 0 |
| 23.05.2017 08:00 - 09:00 | 0 | 0 | 0 | 0 |
| 23.05.2017 09:00 - 10:00 | 0 | 0 | 0 | 0 |
| 23.05.2017 10:00 - 11:00 | 0 | 0 | 0 | 0 |
| 23.05.2017 11:00 - 12:00 | 0 | 0 | 0 | 0 |
| 23.05.2017 12:00 - 13:00 | 0 | 0 | 0 | 0 |
| 23.05.2017 13:00 - 14:00 | 0 | 0 | 0 | 0 |
| 23.05.2017 14:00 - 15:00 | 0 | 0 | 0 | 0 |
| 23.05.2017 15:00 - 16:00 | 0 | 0 | 0 | 0 |
| 23.05.2017 16:00 - 17:00 | 0 | 0 | 0 | 0 |
| 23.05.2017 17:00 - 18:00 | 0 | 0 | 0 | 0 |
| 23.05.2017 18:00 - 19:00 | 0 | 0 | 0 | 0 |
| 23.05.2017 19:00 - 20:00 | 0 | 0 | 0 | 0 |
| 23.05.2017 20:00 - 21:00 | 0 | 0 | 0 | 0 |
| 23.05.2017 21:00 - 22:00 | 0 | 0 | 0 | 0 |
| 23.05.2017 22:00 - 23:00 | 0 | 0 | 0 | 0 |
| 23.05.2017 23:00 - 24:00 | 0 | 0 | 0 | 0 |
| 24.05.2017 00:00 - 01:00 | 0 | 0 | 0 | 0 |
| 24.05.2017 01:00 - 02:00 | 0 | 0 | 0 | 0 |
| 24.05.2017 02:00 - 03:00 | 90 | 0 | 0 | 0 |
| 24.05.2017 03:00 - 04:00 | 90 | 0 | 0 | 0 |
| 24.05.2017 04:00 - 05:00 | 90 | 0 | 0 | 0 |
| 24.05.2017 05:00 - 06:00 | 90 | 0 | 0 | 0 |
| 24.05.2017 06:00 - 07:00 | 0 | 0 | 0 | 0 |
| 24.05.2017 07:00 - 08:00 | 0 | 0 | 0 | 0 |
| 24.05.2017 08:00 - 09:00 | 0 | 0 | 0 | 0 |
| 24.05.2017 09:00 - 10:00 | 0 | 0 | 0 | 0 |
| 24.05.2017 10:00 - 11:00 | 0 | 0 | 0 | 0 |
| 24.05.2017 11:00 - 12:00 | 0 | 0 | 0 | 0 |
| 24.05.2017 12:00 - 13:00 | 0 | 0 | 0 | 0 |
| 24.05.2017 13:00 - 14:00 | 0 | 0 | 0 | 0 |
| 24.05.2017 14:00 - 15:00 | 0 | 0 | 0 | 0 |
| 24.05.2017 15:00 - 16:00 | 0 | 0 | 0 | 0 |
| 24.05.2017 16:00 - 17:00 | 0 | 0 | 0 | 0 |
| 24.05.2017 17:00 - 18:00 | 0 | 0 | 0 | 0 |
| 24.05.2017 18:00 - 19:00 | 0 | 0 | 0 | 0 |
| 24.05.2017 19:00 - 20:00 | 0 | 0 | 0 | 0 |
| 24.05.2017 20:00 - 21:00 | 0 | 0 | 0 | 0 |
| 24.05.2017 21:00 - 22:00 | 0 | 0 | 0 | 0 |
| 24.05.2017 22:00 - 23:00 | 0 | 0 | 0 | 0 |
| 24.05.2017 23:00 - 24:00 | 0 | 0 | 0 | 0 |
| 25.05.2017 00:00 - 01:00 | 0 | 0 | 0 | 0 |
| 25.05.2017 01:00 - 02:00 | 0 | 0 | 0 | 0 |
| 25.05.2017 02:00 - 03:00 | 0 | 0 | 0 | 0 |
| 25.05.2017 03:00 - 04:00 | 0 | 0 | 0 | 0 |
| 25.05.2017 04:00 - 05:00 | 0 | 0 | 0 | 0 |
| 25.05.2017 05:00 - 06:00 | 0 | 0 | 0 | 0 |
| 25.05.2017 06:00 - 07:00 | 0 | 0 | 0 | 0 |
| 25.05.2017 07:00 - 08:00 | 0 | 0 | 0 | 0 |
| 25.05.2017 08:00 - 09:00 | 0 | 0 | 0 | 0 |
| 25.05.2017 09:00 - 10:00 | 0 | 0 | 0 | 0 |
| 25.05.2017 10:00 - 11:00 | 0 | 0 | 0 | 0 |
| 25.05.2017 11:00 - 12:00 | 0 | 0 | 0 | 0 |
| 25.05.2017 12:00 - 13:00 | 0 | 0 | 0 | 0 |
| 25.05.2017 13:00 - 14:00 | 0 | 0 | 0 | 0 |
| 25.05.2017 14:00 - 15:00 | 0 | 0 | 0 | 0 |
| 25.05.2017 15:00 - 16:00 | 0 | 0 | 0 | 0 |
| 25.05.2017 16:00 - 17:00 | 0 | 0 | 0 | 0 |
| 25.05.2017 17:00 - 18:00 | 0 | 0 | 0 | 0 |
| 25.05.2017 18:00 - 19:00 | 0 | 0 | 0 | 0 |
| 25.05.2017 19:00 - 20:00 | 0 | 0 | 0 | 0 |
| 25.05.2017 20:00 - 21:00 | 0 | 0 | 0 | 0 |
| 25.05.2017 21:00 - 22:00 | 0 | 0 | 0 | 0 |
| 25.05.2017 22:00 - 23:00 | 0 | 0 | 0 | 0 |
| 25.05.2017 23:00 - 24:00 | 0 | 0 | 0 | 0 |
| 26.05.2017 00:00 - 01:00 | 0 | 0 | 0 | 0 |
| 26.05.2017 01:00 - 02:00 | 0 | 0 | 0 | 0 |
| 26.05.2017 02:00 - 03:00 | 0 | 0 | 0 | 0 |
| 26.05.2017 03:00 - 04:00 | 0 | 0 | 0 | 0 |
| 26.05.2017 04:00 - 05:00 | 0 | 0 | 0 | 0 |
| 26.05.2017 05:00 - 06:00 | 0 | 0 | 0 | 0 |
| 26.05.2017 06:00 - 07:00 | 0 | 0 | 0 | 0 |
| 26.05.2017 07:00 - 08:00 | 0 | 0 | 0 | 0 |
| 26.05.2017 08:00 - 09:00 | 0 | 0 | 0 | 0 |
| 26.05.2017 09:00 - 10:00 | 0 | 0 | 0 | 0 |
| 26.05.2017 10:00 - 11:00 | 0 | 0 | 0 | 0 |
| 26.05.2017 11:00 - 12:00 | 0 | 0 | 0 | 0 |
| 26.05.2017 12:00 - 13:00 | 0 | 0 | 0 | 0 |
| 26.05.2017 13:00 - 14:00 | 0 | 0 | 0 | 0 |
| 26.05.2017 14:00 - 15:00 | 0 | 0 | 0 | 0 |
| 26.05.2017 15:00 - 16:00 | 0 | 0 | 0 | 0 |
| 26.05.2017 16:00 - 17:00 | 0 | 0 | 0 | 0 |
| 26.05.2017 17:00 - 18:00 | 0 | 0 | 0 | 0 |
| 26.05.2017 18:00 - 19:00 | 0 | 0 | 0 | 0 |
| 26.05.2017 19:00 - 20:00 | 0 | 0 | 0 | 0 |
| 26.05.2017 20:00 - 21:00 | 0 | 0 | 0 | 0 |
| 26.05.2017 21:00 - 22:00 | 0 | 0 | 0 | 0 |
| 26.05.2017 22:00 - 23:00 | 0 | 0 | 0 | 0 |
| 26.05.2017 23:00 - 24:00 | 0 | 0 | 0 | 0 |
| 27.05.2017 00:00 - 01:00 | 0 | 0 | 0 | 0 |
| 27.05.2017 01:00 - 02:00 | 0 | 0 | 0 | 0 |
| 27.05.2017 02:00 - 03:00 | 0 | 0 | 0 | 0 |
| 27.05.2017 03:00 - 04:00 | 0 | 0 | 0 | 0 |
| 27.05.2017 04:00 - 05:00 | 0 | 0 | 0 | 0 |
| 27.05.2017 05:00 - 06:00 | 0 | 0 | 0 | 0 |
| 27.05.2017 06:00 - 07:00 | 0 | 0 | 0 | 0 |
| 27.05.2017 07:00 - 08:00 | 0 | 0 | 0 | 0 |
| 27.05.2017 08:00 - 09:00 | 0 | 0 | 0 | 0 |
| 27.05.2017 09:00 - 10:00 | 0 | 0 | 0 | 0 |
| 27.05.2017 10:00 - 11:00 | 0 | 0 | 0 | 0 |
| 27.05.2017 11:00 - 12:00 | 0 | 0 | 0 | 0 |
| 27.05.2017 12:00 - 13:00 | 0 | 0 | 0 | 0 |
| 27.05.2017 13:00 - 14:00 | 0 | 0 | 0 | 0 |
| 27.05.2017 14:00 - 15:00 | 0 | 0 | 0 | 0 |
| 27.05.2017 15:00 - 16:00 | 0 | 0 | 0 | 0 |
| 27.05.2017 16:00 - 17:00 | 0 | 0 | 0 | 0 |
| 27.05.2017 17:00 - 18:00 | 0 | 0 | 0 | 0 |
| 27.05.2017 18:00 - 19:00 | 0 | 0 | 0 | 0 |
| 27.05.2017 19:00 - 20:00 | 0 | 0 | 0 | 0 |
| 27.05.2017 20:00 - 21:00 | 0 | 0 | 0 | 0 |
| 27.05.2017 21:00 - 22:00 | 0 | 0 | 0 | 0 |
| 27.05.2017 22:00 - 23:00 | 0 | 0 | 0 | 0 |
| 27.05.2017 23:00 - 24:00 | 0 | 0 | 0 | 0 |
| 28.05.2017 00:00 - 01:00 | 0 | 0 | 0 | 0 |
| 28.05.2017 01:00 - 02:00 | 0 | 0 | 0 | 0 |
| 28.05.2017 02:00 - 03:00 | 0 | 0 | 0 | 0 |
| 28.05.2017 03:00 - 04:00 | 0 | 0 | 0 | 0 |
| 28.05.2017 04:00 - 05:00 | 0 | 0 | 0 | 0 |
| 28.05.2017 05:00 - 06:00 | 0 | 0 | 0 | 0 |
| 28.05.2017 06:00 - 07:00 | 0 | 0 | 0 | 0 |
| 28.05.2017 07:00 - 08:00 | 0 | 0 | 0 | 0 |
| 28.05.2017 08:00 - 09:00 | 0 | 0 | 0 | 0 |
| 28.05.2017 09:00 - 10:00 | 0 | 0 | 0 | 0 |
| 28.05.2017 10:00 - 11:00 | 0 | 0 | 0 | 0 |
| 28.05.2017 11:00 - 12:00 | 0 | 0 | 0 | 0 |
| 28.05.2017 12:00 - 13:00 | 0 | 0 | 0 | 0 |
| 28.05.2017 13:00 - 14:00 | 0 | 0 | 0 | 0 |
| 28.05.2017 14:00 - 15:00 | 0 | -20 | 0 | 0 |
| 28.05.2017 15:00 - 16:00 | 0 | -20 | 0 | 0 |
| 28.05.2017 16:00 - 17:00 | 0 | -20 | 0 | 0 |
| 28.05.2017 17:00 - 18:00 | 0 | -20 | 0 | 0 |
| 28.05.2017 18:00 - 19:00 | 0 | -20 | 0 | 0 |
| 28.05.2017 19:00 - 20:00 | 0 | -20 | 0 | 0 |
| 28.05.2017 20:00 - 21:00 | 0 | -20 | 0 | 0 |
| 28.05.2017 21:00 - 22:00 | 0 | -20 | 0 | 0 |
| 28.05.2017 22:00 - 23:00 | 0 | -20 | 0 | 0 |
| 28.05.2017 23:00 - 24:00 | 0 | -20 | 0 | 0 |
| 29.05.2017 00:00 - 01:00 | 0 | -20 | 0 | 0 |
| 29.05.2017 01:00 - 02:00 | 0 | -20 | 0 | 0 |
| 29.05.2017 02:00 - 03:00 | 0 | -20 | 0 | 0 |
| 29.05.2017 03:00 - 04:00 | 0 | -20 | 0 | 0 |
| 29.05.2017 04:00 - 05:00 | 0 | -20 | 0 | 0 |
| 29.05.2017 05:00 - 06:00 | 0 | -20 | 0 | 0 |
| 29.05.2017 06:00 - 07:00 | 0 | 0 | 0 | 0 |
| 29.05.2017 07:00 - 08:00 | 0 | 0 | 0 | 0 |
| 29.05.2017 08:00 - 09:00 | 0 | 0 | 0 | 0 |
| 29.05.2017 09:00 - 10:00 | 0 | 0 | 0 | 0 |
| 29.05.2017 10:00 - 11:00 | 0 | 0 | 0 | 0 |
| 29.05.2017 11:00 - 12:00 | 0 | 0 | 0 | 0 |
| 29.05.2017 12:00 - 13:00 | 0 | 0 | 0 | 0 |
| 29.05.2017 13:00 - 14:00 | 0 | 0 | 0 | 0 |
| 29.05.2017 14:00 - 15:00 | 0 | 0 | 0 | 0 |
| 29.05.2017 15:00 - 16:00 | 0 | 0 | 0 | 0 |
| 29.05.2017 16:00 - 17:00 | 0 | 0 | 0 | 0 |
| 29.05.2017 17:00 - 18:00 | 0 | 0 | 0 | 0 |
| 29.05.2017 18:00 - 19:00 | 0 | 0 | 0 | 0 |
| 29.05.2017 19:00 - 20:00 | 0 | -60 | 0 | 0 |
| 29.05.2017 20:00 - 21:00 | 0 | -90 | 0 | 0 |
| 29.05.2017 21:00 - 22:00 | 0 | -90 | 0 | 0 |
| 29.05.2017 22:00 - 23:00 | 0 | -90 | 0 | 0 |
| 29.05.2017 23:00 - 24:00 | 0 | -90 | 0 | 0 |
| 30.05.2017 00:00 - 01:00 | 0 | -120 | 0 | 0 |
| 30.05.2017 01:00 - 02:00 | 0 | -120 | 0 | 0 |
| 30.05.2017 02:00 - 03:00 | 0 | -120 | 0 | 0 |
| 30.05.2017 03:00 - 04:00 | 0 | -120 | 0 | 0 |
| 30.05.2017 04:00 - 05:00 | 0 | -120 | 0 | 0 |
| 30.05.2017 05:00 - 06:00 | 0 | -120 | 0 | 0 |
| 30.05.2017 06:00 - 07:00 | 0 | 0 | 0 | 0 |
| 30.05.2017 07:00 - 08:00 | 0 | 0 | 0 | 0 |
| 30.05.2017 08:00 - 09:00 | 0 | 0 | 0 | 0 |
| 30.05.2017 09:00 - 10:00 | 0 | 0 | 0 | 0 |
| 30.05.2017 10:00 - 11:00 | 0 | 0 | 0 | 0 |
| 30.05.2017 11:00 - 12:00 | 0 | 0 | 0 | 0 |
| 30.05.2017 12:00 - 13:00 | 0 | 0 | 0 | 0 |
| 30.05.2017 13:00 - 14:00 | 0 | 0 | 0 | 0 |
| 30.05.2017 14:00 - 15:00 | 0 | 0 | 0 | 0 |
| 30.05.2017 15:00 - 16:00 | 0 | 0 | 0 | 0 |
| 30.05.2017 16:00 - 17:00 | 0 | 0 | 0 | 0 |
| 30.05.2017 17:00 - 18:00 | 0 | 0 | 0 | 0 |
| 30.05.2017 18:00 - 19:00 | 0 | -40 | 0 | 0 |
| 30.05.2017 19:00 - 20:00 | 0 | -40 | 0 | 0 |
| 30.05.2017 20:00 - 21:00 | 0 | -40 | 0 | 0 |
| 30.05.2017 21:00 - 22:00 | 0 | -90 | 0 | 0 |
| 30.05.2017 22:00 - 23:00 | 0 | -90 | 0 | 0 |
| 30.05.2017 23:00 - 24:00 | 0 | -90 | 0 | 0 |
| 31.05.2017 00:00 - 01:00 | 0 | -120 | 0 | 0 |
| 31.05.2017 01:00 - 02:00 | 0 | -150 | 0 | 0 |
| 31.05.2017 02:00 - 03:00 | 0 | -150 | 0 | 0 |
| 31.05.2017 03:00 - 04:00 | 0 | -150 | 0 | 0 |
| 31.05.2017 04:00 - 05:00 | 0 | -150 | 0 | 0 |
| 31.05.2017 05:00 - 06:00 | 0 | -150 | 0 | 0 |
| 31.05.2017 06:00 - 07:00 | 0 | 0 | 0 | 0 |
| 31.05.2017 07:00 - 08:00 | 0 | 0 | 0 | 0 |
| 31.05.2017 08:00 - 09:00 | 0 | 0 | 0 | 0 |
| 31.05.2017 09:00 - 10:00 | 0 | 0 | 0 | 0 |
| 31.05.2017 10:00 - 11:00 | 0 | 0 | 0 | 0 |
| 31.05.2017 11:00 - 12:00 | 0 | 0 | 0 | 0 |
| 31.05.2017 12:00 - 13:00 | 0 | 0 | 0 | 0 |
| 31.05.2017 13:00 - 14:00 | 0 | 0 | 0 | 0 |
| 31.05.2017 14:00 - 15:00 | 0 | 0 | 0 | 0 |
| 31.05.2017 15:00 - 16:00 | 0 | 0 | 0 | 0 |
| 31.05.2017 16:00 - 17:00 | 0 | 0 | 0 | 0 |
| 31.05.2017 17:00 - 18:00 | 0 | 0 | 0 | 0 |
| 31.05.2017 18:00 - 19:00 | 0 | 0 | 0 | 0 |
| 31.05.2017 19:00 - 20:00 | 0 | 0 | 0 | 0 |
| 31.05.2017 20:00 - 21:00 | 0 | 0 | 0 | 0 |
| 31.05.2017 21:00 - 22:00 | 0 | 0 | 0 | 0 |
| 31.05.2017 22:00 - 23:00 | 0 | 0 | 0 | 0 |
| 31.05.2017 23:00 - 24:00 | 0 | 0 | 0 | 0 |
| 01.06.2017 00:00 - 01:00 | 0 | 0 | 0 | 0 |
| 01.06.2017 01:00 - 02:00 | 0 | 0 | 0 | 0 |
| 01.06.2017 02:00 - 03:00 | 0 | 0 | 0 | 0 |
| 01.06.2017 03:00 - 04:00 | 0 | 0 | 0 | 0 |
| 01.06.2017 04:00 - 05:00 | 0 | 0 | 0 | 0 |
| 01.06.2017 05:00 - 06:00 | 0 | 0 | 0 | 0 |